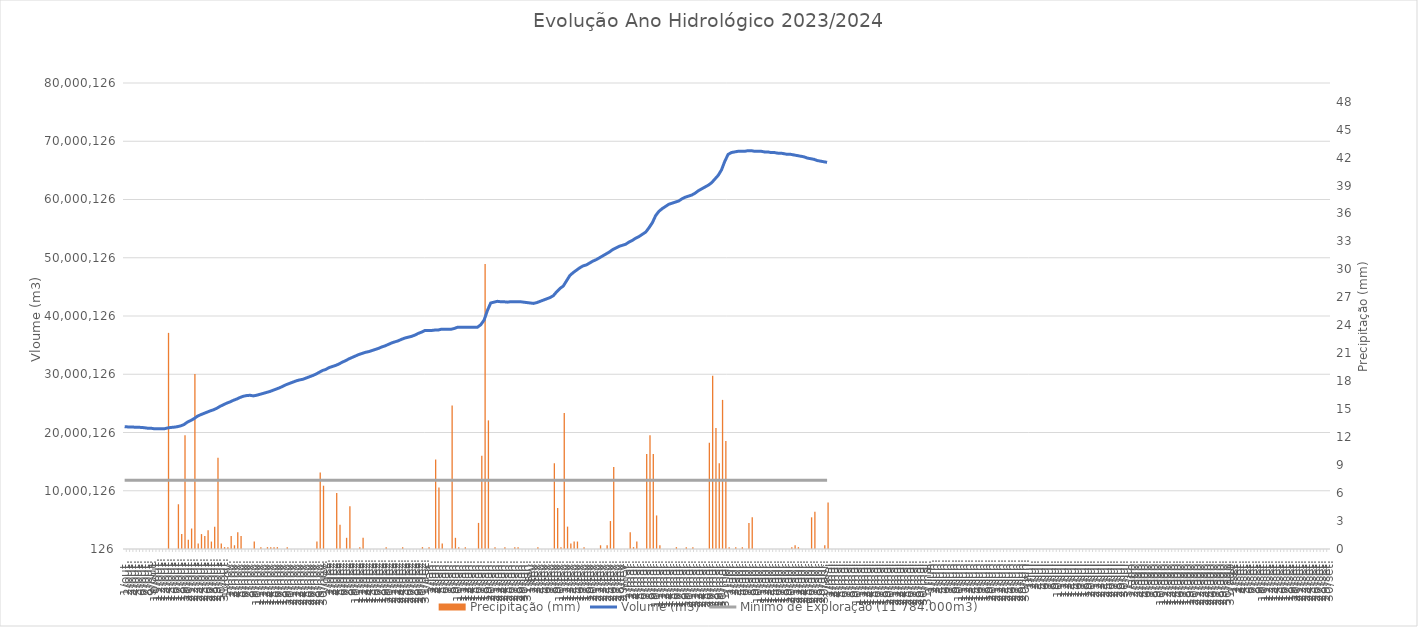
| Category | Precipitação (mm) |
|---|---|
| 2023-10-06 | 0 |
| 2023-10-07 | 0 |
| 2023-10-08 | 0 |
| 2023-10-09 | 0 |
| 2023-10-10 | 0 |
| 2023-10-11 | 0 |
| 2023-10-12 | 0 |
| 2023-10-13 | 0 |
| 2023-10-14 | 0 |
| 2023-10-15 | 0 |
| 2023-10-16 | 0 |
| 2023-10-17 | 0 |
| 2023-10-18 | 0 |
| 2023-10-19 | 23.19 |
| 2023-10-20 | 0 |
| 2023-10-21 | 0 |
| 2023-10-22 | 4.8 |
| 2023-10-23 | 1.6 |
| 2023-10-24 | 12.2 |
| 2023-10-25 | 1 |
| 2023-10-26 | 2.2 |
| 2023-10-27 | 18.79 |
| 2023-10-28 | 0.6 |
| 2023-10-29 | 1.6 |
| 2023-10-30 | 1.4 |
| 2023-10-31 | 2 |
| 2023-11-01 | 0.8 |
| 2023-11-02 | 2.4 |
| 2023-11-03 | 9.8 |
| 2023-11-04 | 0.6 |
| 2023-11-05 | 0.2 |
| 2023-11-06 | 0.2 |
| 2023-11-07 | 1.4 |
| 2023-11-08 | 0.4 |
| 2023-11-09 | 1.8 |
| 2023-11-10 | 1.4 |
| 2023-11-11 | 0 |
| 2023-11-12 | 0 |
| 2023-11-13 | 0 |
| 2023-11-14 | 0.8 |
| 2023-11-15 | 0 |
| 2023-11-16 | 0.2 |
| 2023-11-17 | 0 |
| 2023-11-18 | 0.2 |
| 2023-11-19 | 0.2 |
| 2023-11-20 | 0.2 |
| 2023-11-21 | 0.2 |
| 2023-11-22 | 0 |
| 2023-11-23 | 0 |
| 2023-11-24 | 0.2 |
| 2023-11-25 | 0 |
| 2023-11-26 | 0 |
| 2023-11-27 | 0 |
| 2023-11-28 | 0 |
| 2023-11-29 | 0 |
| 2023-11-30 | 0 |
| 2023-12-01 | 0 |
| 2023-12-02 | 0 |
| 2023-12-03 | 0.8 |
| 2023-12-04 | 8.2 |
| 2023-12-05 | 6.79 |
| 2023-12-06 | 0 |
| 2023-12-07 | 0 |
| 2023-12-08 | 0 |
| 2023-12-09 | 6 |
| 2023-12-10 | 2.6 |
| 2023-12-11 | 0 |
| 2023-12-12 | 1.2 |
| 2023-12-13 | 4.6 |
| 2023-12-14 | 0 |
| 2023-12-15 | 0 |
| 2023-12-16 | 0.2 |
| 2023-12-17 | 1.2 |
| 2023-12-18 | 0 |
| 2023-12-19 | 0 |
| 2023-12-20 | 0 |
| 2023-12-21 | 0 |
| 2023-12-22 | 0 |
| 2023-12-23 | 0 |
| 2023-12-24 | 0.2 |
| 2023-12-25 | 0 |
| 2023-12-26 | 0 |
| 2023-12-27 | 0 |
| 2023-12-28 | 0 |
| 2023-12-29 | 0.2 |
| 2023-12-30 | 0 |
| 2023-12-31 | 0 |
| 2024-01-01 | 0 |
| 2024-01-02 | 0 |
| 2024-01-03 | 0 |
| 2024-01-04 | 0.2 |
| 2024-01-05 | 0 |
| 2024-01-06 | 0.2 |
| 2024-01-07 | 0 |
| 2024-01-08 | 9.6 |
| 2024-01-09 | 6.6 |
| 2024-01-10 | 0.6 |
| 2024-01-11 | 0 |
| 2024-01-12 | 0 |
| 2024-01-13 | 15.39 |
| 2024-01-14 | 1.2 |
| 2024-01-15 | 0.2 |
| 2024-01-16 | 0 |
| 2024-01-17 | 0.2 |
| 2024-01-18 | 0 |
| 2024-01-19 | 0 |
| 2024-01-20 | 0 |
| 2024-01-21 | 2.8 |
| 2024-01-22 | 10 |
| 2024-01-23 | 30.59 |
| 2024-01-24 | 13.8 |
| 2024-01-25 | 0 |
| 2024-01-26 | 0.2 |
| 2024-01-27 | 0 |
| 2024-01-28 | 0 |
| 2024-01-29 | 0.2 |
| 2024-01-30 | 0 |
| 2024-01-31 | 0 |
| 2024-02-01 | 0.2 |
| 2024-02-02 | 0.2 |
| 2024-02-03 | 0 |
| 2024-02-04 | 0 |
| 2024-02-05 | 0 |
| 2024-02-06 | 0 |
| 2024-02-07 | 0 |
| 2024-02-08 | 0.2 |
| 2024-02-09 | 0 |
| 2024-02-10 | 0 |
| 2024-02-11 | 0 |
| 2024-02-12 | 0 |
| 2024-02-13 | 9.2 |
| 2024-02-14 | 4.39 |
| 2024-02-15 | 0.2 |
| 2024-02-16 | 14.6 |
| 2024-02-17 | 2.4 |
| 2024-02-18 | 0.6 |
| 2024-02-19 | 0.8 |
| 2024-02-20 | 0.8 |
| 2024-02-21 | 0 |
| 2024-02-22 | 0.2 |
| 2024-02-23 | 0 |
| 2024-02-24 | 0 |
| 2024-02-25 | 0 |
| 2024-02-26 | 0 |
| 2024-02-27 | 0.4 |
| 2024-02-28 | 0 |
| 2024-02-29 | 0.4 |
| 2024-03-01 | 3 |
| 2024-03-02 | 8.8 |
| 2024-03-03 | 0 |
| 2024-03-04 | 0 |
| 2024-03-05 | 0 |
| 2024-03-06 | 0 |
| 2024-03-07 | 1.8 |
| 2024-03-08 | 0.2 |
| 2024-03-09 | 0.8 |
| 2024-03-10 | 0 |
| 2024-03-11 | 0 |
| 2024-03-12 | 10.19 |
| 2024-03-13 | 12.2 |
| 2024-03-14 | 10.2 |
| 2024-03-15 | 3.6 |
| 2024-03-16 | 0.4 |
| 2024-03-17 | 0 |
| 2024-03-18 | 0 |
| 2024-03-19 | 0 |
| 2024-03-20 | 0 |
| 2024-03-21 | 0.2 |
| 2024-03-22 | 0 |
| 2024-03-23 | 0 |
| 2024-03-24 | 0.2 |
| 2024-03-25 | 0 |
| 2024-03-26 | 0.2 |
| 2024-03-27 | 0 |
| 2024-03-28 | 0 |
| 2024-03-29 | 0 |
| 2024-03-30 | 0 |
| 2024-03-31 | 11.4 |
| 2024-04-01 | 18.6 |
| 2024-04-02 | 12.99 |
| 2024-04-03 | 9.2 |
| 2024-04-04 | 16 |
| 2024-04-05 | 11.59 |
| 2024-04-06 | 0.2 |
| 2024-04-07 | 0 |
| 2024-04-08 | 0.2 |
| 2024-04-09 | 0 |
| 2024-04-10 | 0.2 |
| 2024-04-11 | 0 |
| 2024-04-12 | 2.8 |
| 2024-04-13 | 3.4 |
| 2024-04-14 | 0 |
| 2024-04-15 | 0 |
| 2024-04-16 | 0 |
| 2024-04-17 | 0 |
| 2024-04-18 | 0 |
| 2024-04-19 | 0 |
| 2024-04-20 | 0 |
| 2024-04-21 | 0 |
| 2024-04-22 | 0 |
| 2024-04-23 | 0 |
| 2024-04-24 | 0 |
| 2024-04-25 | 0.2 |
| 2024-04-26 | 0.4 |
| 2024-04-27 | 0.2 |
| 2024-04-28 | 0 |
| 2024-04-29 | 0 |
| 2024-04-30 | 0 |
| 2024-05-01 | 3.4 |